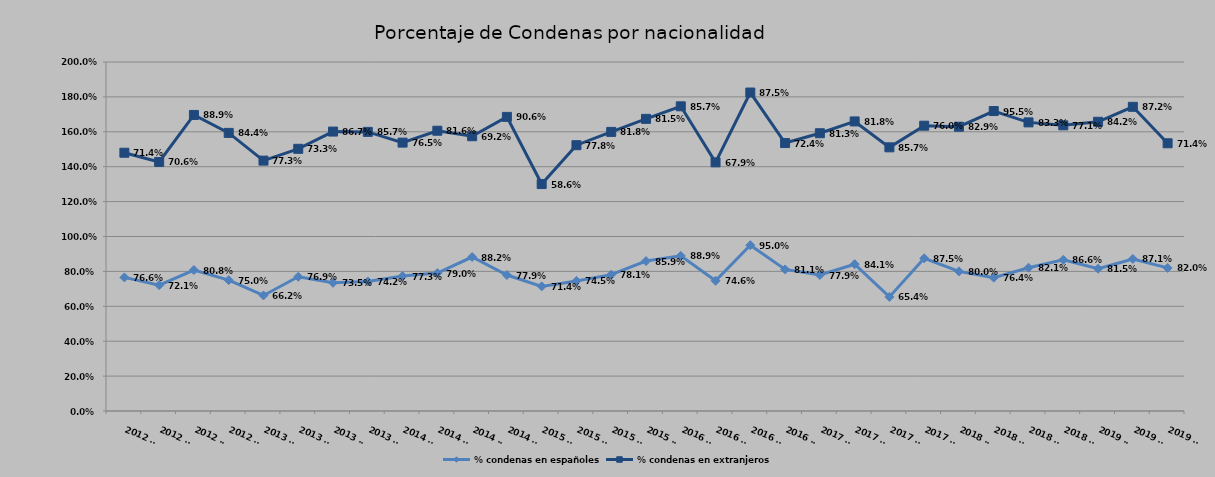
| Category | % condenas en españoles | % condenas en extranjeros |
|---|---|---|
| 2012 T1 | 0.766 | 0.714 |
| 2012 T2 | 0.721 | 0.706 |
| 2012 T3 | 0.808 | 0.889 |
| 2012 T4 | 0.75 | 0.844 |
| 2013 T1 | 0.662 | 0.773 |
| 2013 T2 | 0.769 | 0.733 |
| 2013 T3 | 0.735 | 0.867 |
| 2013 T4 | 0.742 | 0.857 |
| 2014 T1 | 0.773 | 0.765 |
| 2014 T2 | 0.79 | 0.816 |
| 2014 T3 | 0.882 | 0.692 |
| 2014 T4 | 0.779 | 0.906 |
| 2015 T1 | 0.714 | 0.586 |
| 2015 T2 | 0.745 | 0.778 |
| 2015 T3 | 0.781 | 0.818 |
| 2015 T4 | 0.859 | 0.815 |
| 2016 T1 | 0.889 | 0.857 |
| 2016 T2 | 0.746 | 0.679 |
| 2016 T3 | 0.95 | 0.875 |
| 2016 T4 | 0.811 | 0.724 |
| 2017 T1 | 0.779 | 0.812 |
| 2017 T2 | 0.841 | 0.818 |
| 2017 T3 | 0.654 | 0.857 |
| 2017 T4 | 0.875 | 0.76 |
| 2018 T1 | 0.8 | 0.829 |
| 2018 T2 | 0.764 | 0.955 |
| 2018 T3 | 0.821 | 0.833 |
| 2018 T4 | 0.866 | 0.771 |
| 2019 T1 | 0.815 | 0.842 |
| 2019 T2 | 0.871 | 0.872 |
| 2019 T3 | 0.82 | 0.714 |